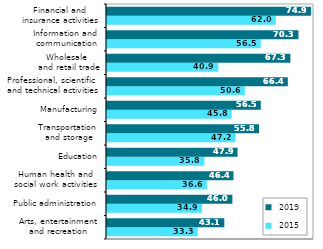
| Category |  2015 |  2019 |
|---|---|---|
|  Arts, entertainment
 and recreation | 33.273 | 43.074 |
| Public administration | 34.929 | 46.037 |
| Human health and
 social work activities  | 36.649 | 46.445 |
| Education | 35.763 | 47.924 |
| Transportation
 and storage | 47.189 | 55.837 |
| Manufacturing | 45.769 | 56.459 |
| Professional, scientific
 and technical activities | 50.609 | 66.387 |
| Wholesale
 and retail trade | 40.868 | 67.329 |
| Information and
 communication | 56.457 | 70.29 |
| Financial and
 insurance activities | 61.962 | 74.932 |